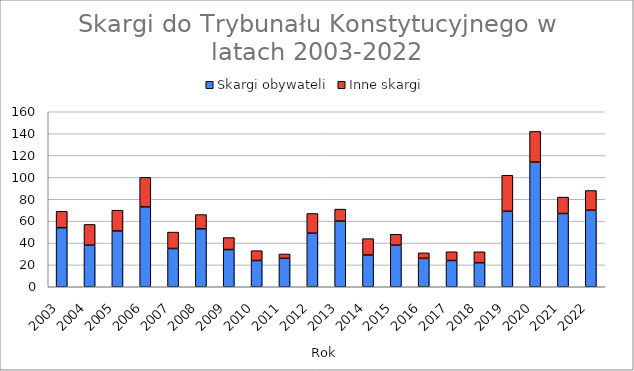
| Category | Skargi obywateli | Inne skargi |
|---|---|---|
| 2003.0 | 54 | 15 |
| 2004.0 | 38 | 19 |
| 2005.0 | 51 | 19 |
| 2006.0 | 73 | 27 |
| 2007.0 | 35 | 15 |
| 2008.0 | 53 | 13 |
| 2009.0 | 34 | 11 |
| 2010.0 | 24 | 9 |
| 2011.0 | 26 | 4 |
| 2012.0 | 49 | 18 |
| 2013.0 | 60 | 11 |
| 2014.0 | 29 | 15 |
| 2015.0 | 38 | 10 |
| 2016.0 | 26 | 5 |
| 2017.0 | 24 | 8 |
| 2018.0 | 22 | 10 |
| 2019.0 | 69 | 33 |
| 2020.0 | 114 | 28 |
| 2021.0 | 67 | 15 |
| 2022.0 | 70 | 18 |